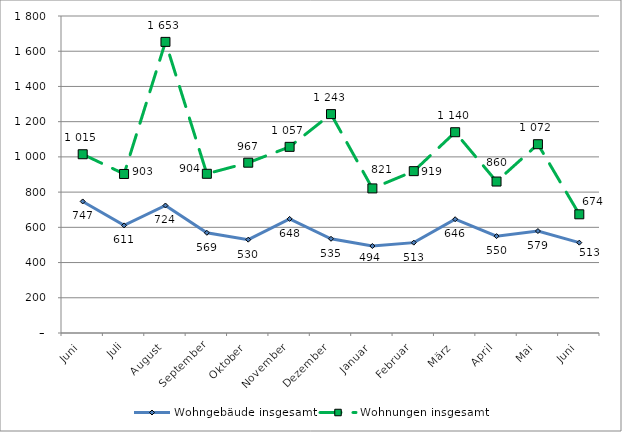
| Category | Wohngebäude insgesamt | Wohnungen insgesamt |
|---|---|---|
| Juni | 747 | 1015 |
| Juli | 611 | 903 |
| August | 724 | 1653 |
| September | 569 | 904 |
| Oktober | 530 | 967 |
| November | 648 | 1057 |
| Dezember | 535 | 1243 |
| Januar | 494 | 821 |
| Februar | 513 | 919 |
| März | 646 | 1140 |
| April | 550 | 860 |
| Mai | 579 | 1072 |
| Juni | 513 | 674 |